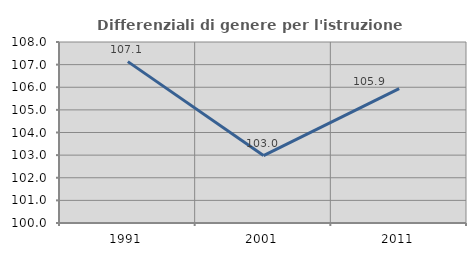
| Category | Differenziali di genere per l'istruzione superiore |
|---|---|
| 1991.0 | 107.133 |
| 2001.0 | 102.982 |
| 2011.0 | 105.941 |